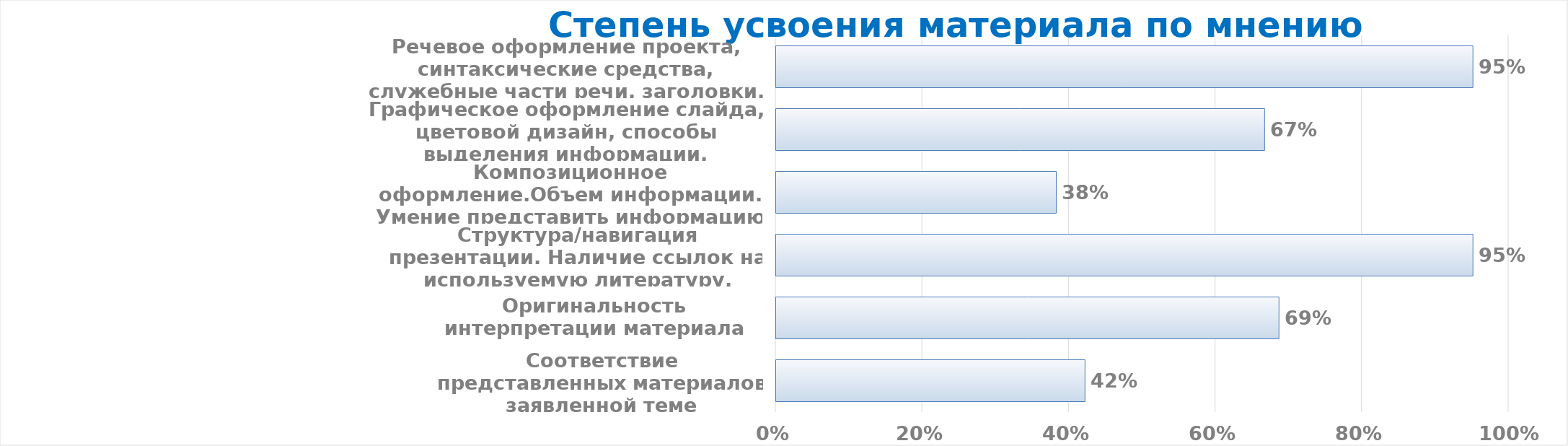
| Category | Series 0 |
|---|---|
| Соответствие представленных материалов заявленной теме | 0.422 |
| Оригинальность интерпретации материала | 0.686 |
| Структура/навигация презентации. Наличие ссылок на используемую литературу. | 0.951 |
| Композиционное оформление.Объем информации. Умение представить информацию разных видов (текстовый материал, картинки, графики, схемы). | 0.382 |
| Графическое оформление слайда, цветовой дизайн, способы выделения информации, анимационные эффекты, шрифты | 0.667 |
| Речевое оформление проекта, синтаксические средства, служебные части речи, заголовки. | 0.951 |